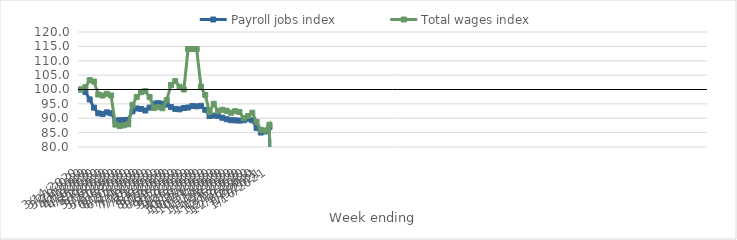
| Category | Payroll jobs index | Total wages index |
|---|---|---|
| 14/03/2020 | 100 | 100 |
| 21/03/2020 | 99.139 | 100.792 |
| 28/03/2020 | 96.555 | 103.274 |
| 04/04/2020 | 93.694 | 102.764 |
| 11/04/2020 | 91.722 | 98.267 |
| 18/04/2020 | 91.437 | 97.905 |
| 25/04/2020 | 92.065 | 98.496 |
| 02/05/2020 | 91.723 | 97.939 |
| 09/05/2020 | 89.201 | 87.78 |
| 16/05/2020 | 89.324 | 87.282 |
| 23/05/2020 | 89.381 | 87.549 |
| 30/05/2020 | 89.465 | 87.891 |
| 06/06/2020 | 92.423 | 94.64 |
| 13/06/2020 | 93.407 | 97.406 |
| 20/06/2020 | 93.244 | 99.065 |
| 27/06/2020 | 92.697 | 99.427 |
| 04/07/2020 | 93.71 | 97.361 |
| 11/07/2020 | 95.084 | 93.535 |
| 18/07/2020 | 95.245 | 93.886 |
| 25/07/2020 | 95.069 | 93.487 |
| 01/08/2020 | 94.763 | 96.283 |
| 08/08/2020 | 93.877 | 101.588 |
| 15/08/2020 | 93.263 | 102.906 |
| 22/08/2020 | 93.104 | 100.962 |
| 29/08/2020 | 93.565 | 99.995 |
| 05/09/2020 | 93.738 | 114.063 |
| 12/09/2020 | 94.255 | 114.063 |
| 19/09/2020 | 94.14 | 114.061 |
| 26/09/2020 | 94.318 | 101.026 |
| 03/10/2020 | 92.947 | 98.137 |
| 10/10/2020 | 90.793 | 92.179 |
| 17/10/2020 | 90.919 | 95.015 |
| 24/10/2020 | 90.852 | 92.434 |
| 31/10/2020 | 90.184 | 92.942 |
| 07/11/2020 | 89.656 | 92.595 |
| 14/11/2020 | 89.318 | 91.92 |
| 21/11/2020 | 89.26 | 92.478 |
| 28/11/2020 | 89.18 | 92.162 |
| 05/12/2020 | 89.292 | 90.034 |
| 12/12/2020 | 89.802 | 90.752 |
| 19/12/2020 | 89.295 | 91.935 |
| 26/12/2020 | 86.602 | 88.723 |
| 02/01/2021 | 85.03 | 85.967 |
| 09/01/2021 | 85.394 | 85.749 |
| 16/01/2021 | 86.917 | 87.756 |